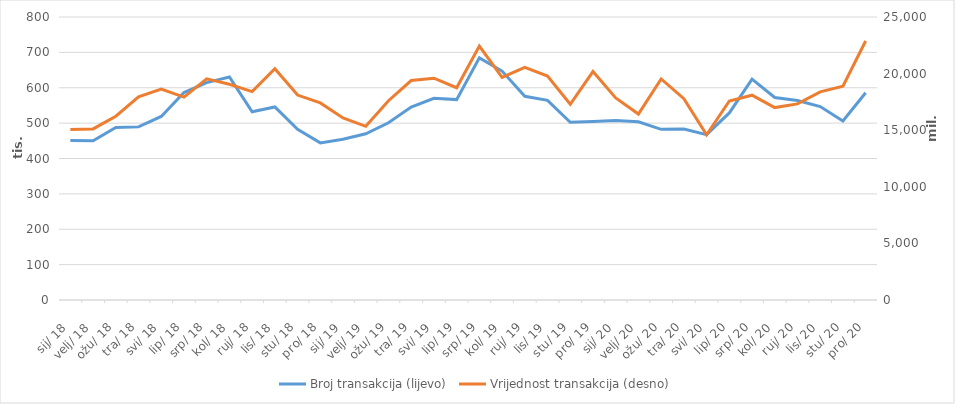
| Category | Broj transakcija (lijevo) |
|---|---|
| 2018-01-01 | 450988 |
| 2018-02-01 | 450334 |
| 2018-03-01 | 487467 |
| 2018-04-01 | 489395 |
| 2018-05-01 | 518931 |
| 2018-06-01 | 586420 |
| 2018-07-01 | 614574 |
| 2018-08-01 | 630321 |
| 2018-09-01 | 532056 |
| 2018-10-01 | 545576 |
| 2018-11-01 | 482247 |
| 2018-12-01 | 444208 |
| 2019-01-01 | 454202 |
| 2019-02-01 | 469910 |
| 2019-03-01 | 501057 |
| 2019-04-01 | 545531 |
| 2019-05-01 | 570013 |
| 2019-06-01 | 566451 |
| 2019-07-01 | 684452 |
| 2019-08-01 | 647183 |
| 2019-09-01 | 575720 |
| 2019-10-01 | 564400 |
| 2019-11-01 | 502281 |
| 2019-12-01 | 504261 |
| 2020-01-01 | 507660 |
| 2020-02-01 | 503747 |
| 2020-03-01 | 482477 |
| 2020-04-01 | 483559 |
| 2020-05-01 | 467455 |
| 2020-06-01 | 528809 |
| 2020-07-01 | 624319 |
| 2020-08-01 | 572502 |
| 2020-09-01 | 563890 |
| 2020-10-01 | 546704 |
| 2020-11-01 | 506200 |
| 2020-12-01 | 585931 |